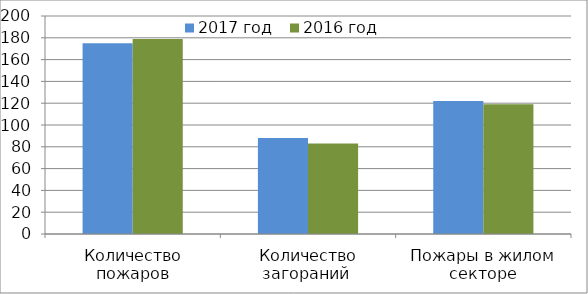
| Category | 2017 год | 2016 год |
|---|---|---|
| Количество пожаров | 175 | 179 |
| Количество загораний  | 88 | 83 |
| Пожары в жилом секторе | 122 | 119 |